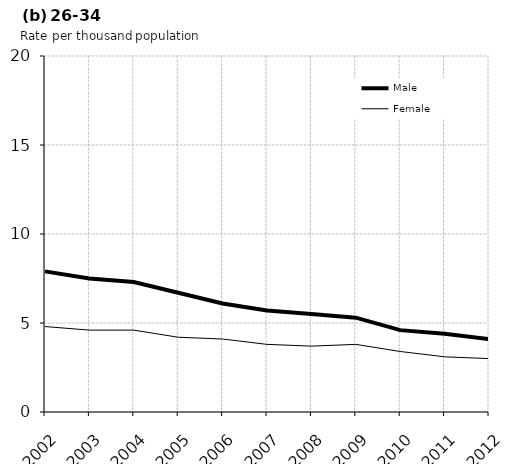
| Category | Male | Female |
|---|---|---|
| 2002.0 | 7.9 | 4.8 |
| 2003.0 | 7.5 | 4.6 |
| 2004.0 | 7.3 | 4.6 |
| 2005.0 | 6.7 | 4.2 |
| 2006.0 | 6.1 | 4.1 |
| 2007.0 | 5.7 | 3.8 |
| 2008.0 | 5.5 | 3.7 |
| 2009.0 | 5.3 | 3.8 |
| 2010.0 | 4.6 | 3.4 |
| 2011.0 | 4.4 | 3.1 |
| 2012.0 | 4.1 | 3 |